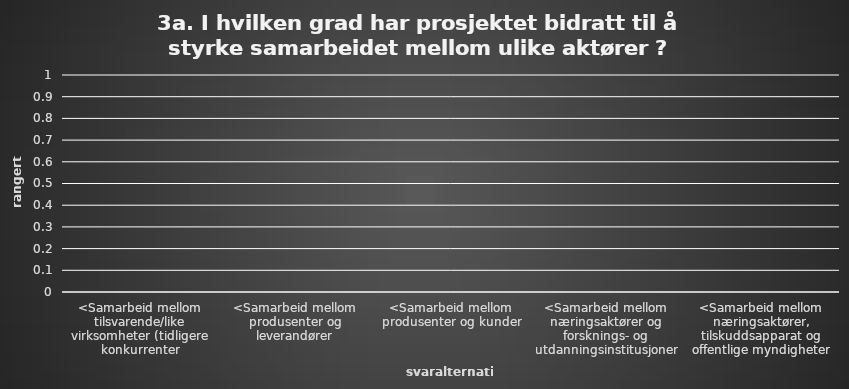
| Category | Series 0 |
|---|---|
| <Samarbeid mellom tilsvarende/like virksomheter (tidligere konkurrenter | 0 |
| <Samarbeid mellom produsenter og leverandører | 0 |
| <Samarbeid mellom produsenter og kunder | 0 |
| <Samarbeid mellom næringsaktører og forsknings- og utdanningsinstitusjoner | 0 |
| <Samarbeid mellom næringsaktører, tilskuddsapparat og offentlige myndigheter | 0 |